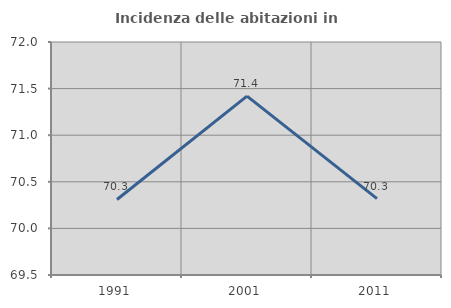
| Category | Incidenza delle abitazioni in proprietà  |
|---|---|
| 1991.0 | 70.311 |
| 2001.0 | 71.419 |
| 2011.0 | 70.32 |